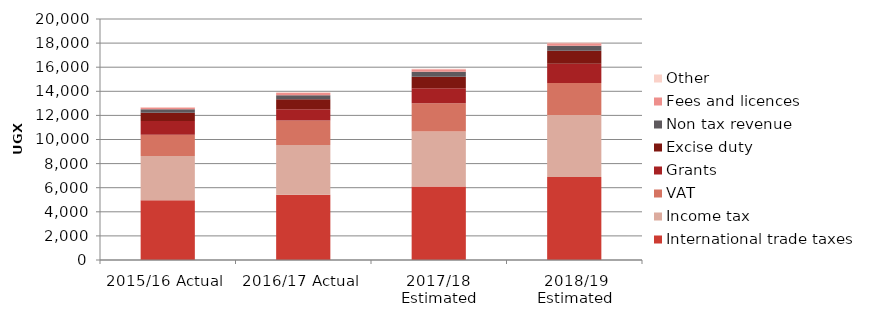
| Category | International trade taxes | Income tax | VAT | Grants | Excise duty | Non tax revenue | Fees and licences | Other |
|---|---|---|---|---|---|---|---|---|
| 2015/16 Actual  | 4961.9 | 3664 | 1772.1 | 1147 | 671.1 | 284.2 | 149.9 | 42.9 |
| 2016/17 Actual  | 5414.6 | 4133.8 | 2022.3 | 950 | 819.8 | 325.4 | 201.9 | 46.3 |
| 2017/18  Estimated | 6096.7 | 4561.1 | 2347.9 | 1251 | 945.5 | 428.6 | 190.2 | 54.5 |
| 2018/19 Estimated | 6889.2 | 5154.1 | 2653.2 | 1595 | 1068.4 | 420 | 214.9 | 61.6 |